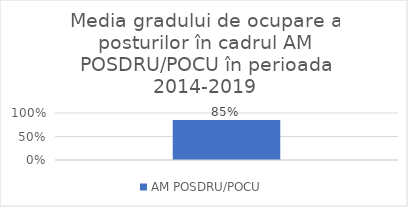
| Category | AM POSDRU/POCU |
|---|---|
|  | 0.85 |